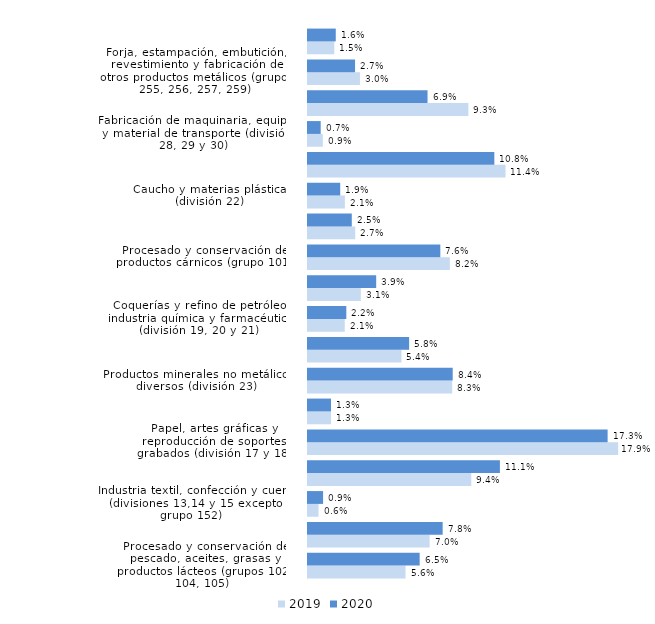
| Category | 2019 | 2020 |
|---|---|---|
| Procesado y conservación de pescado, aceites, grasas y productos lácteos (grupos 102, 104, 105) | 0.056 | 0.065 |
| Fabricación de productos informáticos, eléctricos, electrónicos y ópticos (división 26 y 27) | 0.07 | 0.078 |
| Industria textil, confección y cuero (divisiones 13,14 y 15 excepto grupo 152)  | 0.006 | 0.009 |
| Otras industrias manufactureras y reparación e instalación de maquinaria y equipo (división 32 y 33) | 0.094 | 0.111 |
| Papel, artes gráficas y reproducción de soportes grabados (división 17 y 18) | 0.179 | 0.173 |
| Metalurgia, metales para la construcción, calderas, depósitos contenedores, armas y municiones (división 24 y grupos 251, 252, 253 y 254) | 0.013 | 0.013 |
| Productos minerales no metálicos diversos (división 23) | 0.083 | 0.084 |
| Fabricación de muebles (división 31) | 0.054 | 0.058 |
| Coquerías y refino de petróleo, industria química y farmacéutica (división 19, 20 y 21) | 0.021 | 0.022 |
| Industria de la madera y del corcho, excepto muebles; cestería y espartería (división 16) | 0.031 | 0.039 |
| Procesado y conservación de productos cárnicos (grupo 101) | 0.082 | 0.076 |
| Procesado y conservación de frutas y hortalizas (grupo 103) | 0.027 | 0.025 |
| Caucho y materias plásticas (división 22) | 0.021 | 0.019 |
| Fabricación de calzado (grupo 152) | 0.114 | 0.108 |
| Fabricación de maquinaria, equipo y material de transporte (división 28, 29 y 30) | 0.009 | 0.007 |
| Otras industrias alimenticias, tabaco y bebidas excepto elaboración de vinos (grupos 106, 107, 108, 109, división 12 y división 11 excepto clase 1102) | 0.093 | 0.069 |
| Forja, estampación, embutición, revestimiento y fabricación de otros productos metálicos (grupos 255, 256, 257, 259) | 0.03 | 0.027 |
| Elaboración de vinos (clase 1102) | 0.015 | 0.016 |